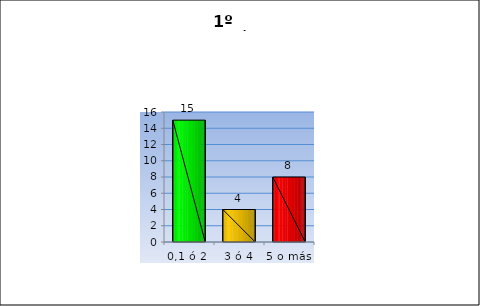
| Category | 1º GESTION |
|---|---|
| 0,1 ó 2  | 15 |
| 3 ó 4 | 4 |
| 5 o más | 8 |